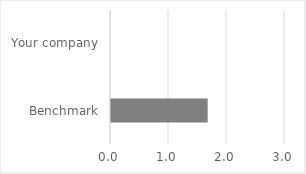
| Category | Understanding of SC performance |
|---|---|
| Benchmark | 1.667 |
| Your company | 0 |